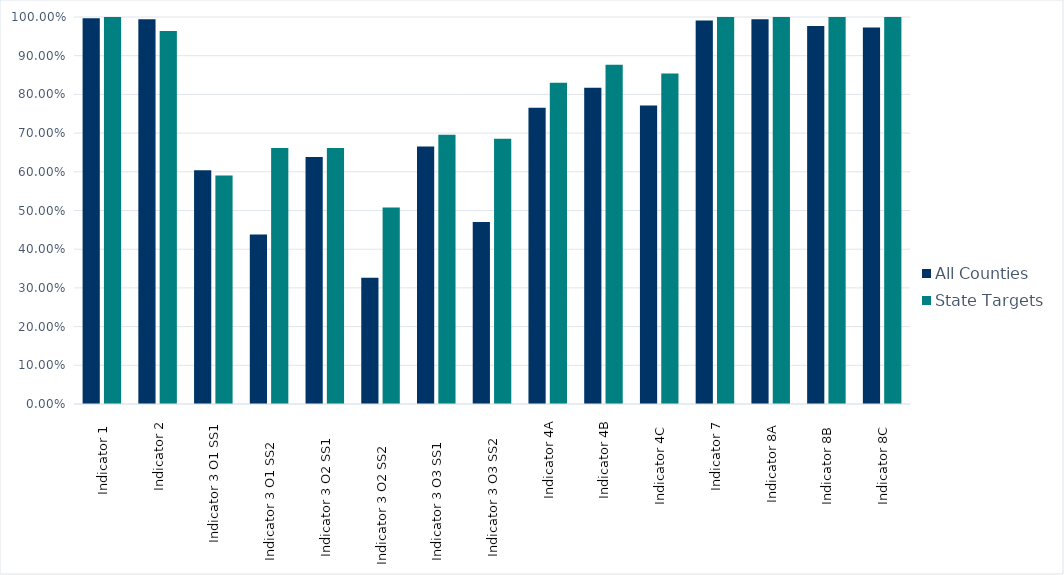
| Category | All Counties | State Targets |
|---|---|---|
| Indicator 1  | 0.996 | 1 |
| Indicator 2 | 0.994 | 0.964 |
| Indicator 3 O1 SS1 | 0.604 | 0.591 |
| Indicator 3 O1 SS2     | 0.438 | 0.662 |
| Indicator 3 O2 SS1    | 0.638 | 0.662 |
| Indicator 3 O2 SS2      | 0.326 | 0.508 |
| Indicator 3 O3 SS1     | 0.665 | 0.696 |
| Indicator 3 O3 SS2    | 0.47 | 0.686 |
| Indicator 4A | 0.766 | 0.83 |
| Indicator 4B | 0.817 | 0.877 |
| Indicator 4C  | 0.771 | 0.854 |
| Indicator 7 | 0.991 | 1 |
| Indicator 8A  | 0.994 | 1 |
| Indicator 8B  | 0.976 | 1 |
| Indicator 8C  | 0.973 | 1 |